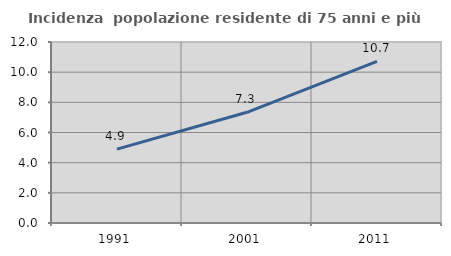
| Category | Incidenza  popolazione residente di 75 anni e più |
|---|---|
| 1991.0 | 4.9 |
| 2001.0 | 7.341 |
| 2011.0 | 10.714 |